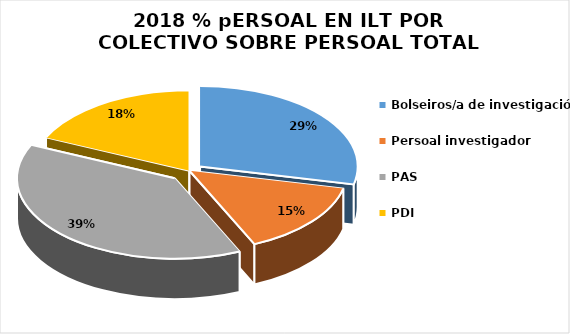
| Category | Series 0 |
|---|---|
| Bolseiros/a de investigación | 0.133 |
| Persoal investigador | 0.069 |
| PAS | 0.18 |
| PDI | 0.085 |